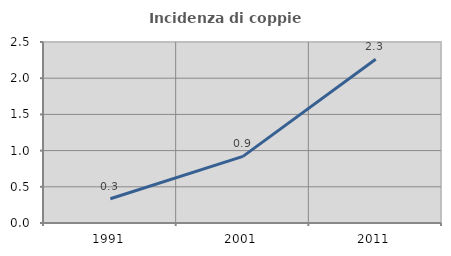
| Category | Incidenza di coppie miste |
|---|---|
| 1991.0 | 0.336 |
| 2001.0 | 0.921 |
| 2011.0 | 2.261 |